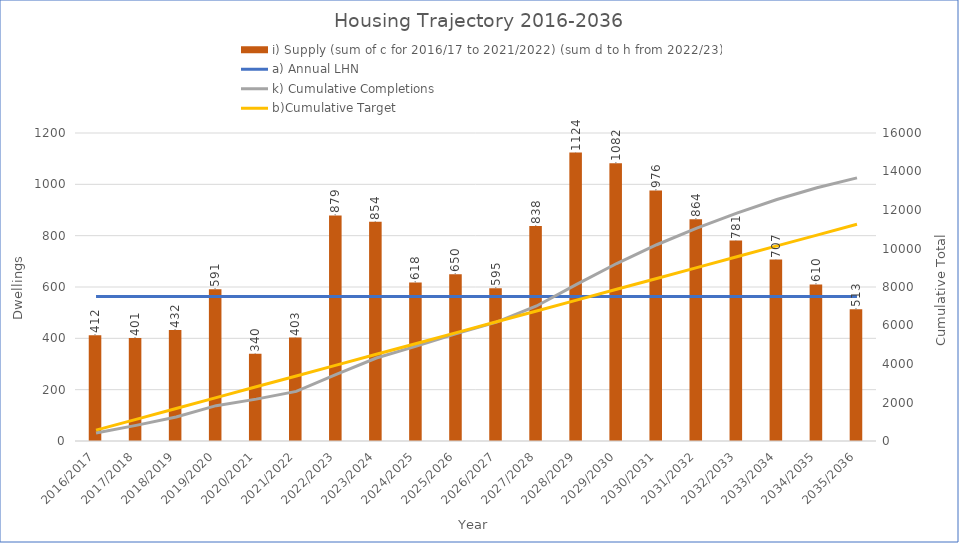
| Category | i) Supply (sum of c for 2016/17 to 2021/2022) (sum d to h from 2022/23) |
|---|---|
| 2016/2017 | 412 |
| 2017/2018 | 401 |
| 2018/2019 | 432 |
| 2019/2020 | 591 |
| 2020/2021 | 340 |
| 2021/2022 | 403 |
| 2022/2023 | 879 |
| 2023/2024 | 854 |
| 2024/2025 | 618 |
| 2025/2026 | 650 |
| 2026/2027 | 595 |
| 2027/2028 | 838 |
| 2028/2029 | 1124 |
| 2029/2030 | 1082 |
| 2030/2031 | 976 |
| 2031/2032 | 864 |
| 2032/2033 | 781 |
| 2033/2034 | 707 |
| 2034/2035 | 610 |
| 2035/2036 | 513 |